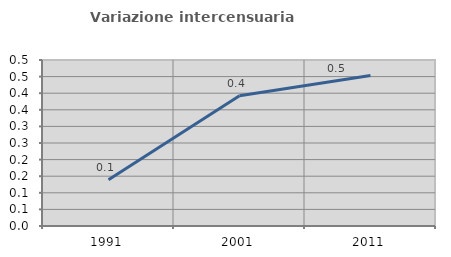
| Category | Variazione intercensuaria annua |
|---|---|
| 1991.0 | 0.139 |
| 2001.0 | 0.393 |
| 2011.0 | 0.453 |